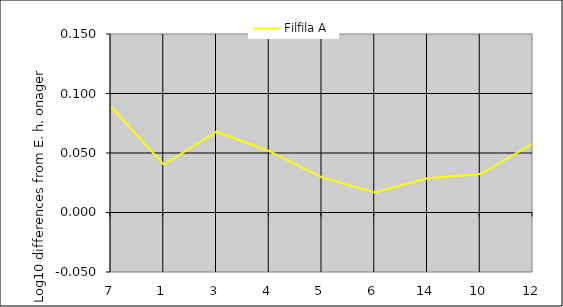
| Category | Filfila A |
|---|---|
| 7.0 | 0.089 |
| 1.0 | 0.04 |
| 3.0 | 0.068 |
| 4.0 | 0.052 |
| 5.0 | 0.03 |
| 6.0 | 0.017 |
| 14.0 | 0.029 |
| 10.0 | 0.032 |
| 12.0 | 0.058 |